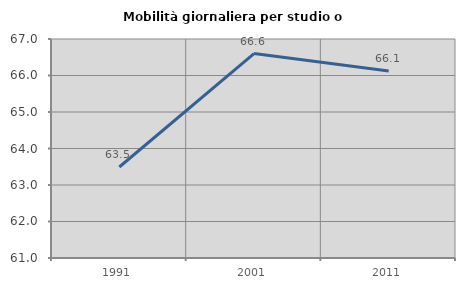
| Category | Mobilità giornaliera per studio o lavoro |
|---|---|
| 1991.0 | 63.493 |
| 2001.0 | 66.601 |
| 2011.0 | 66.123 |